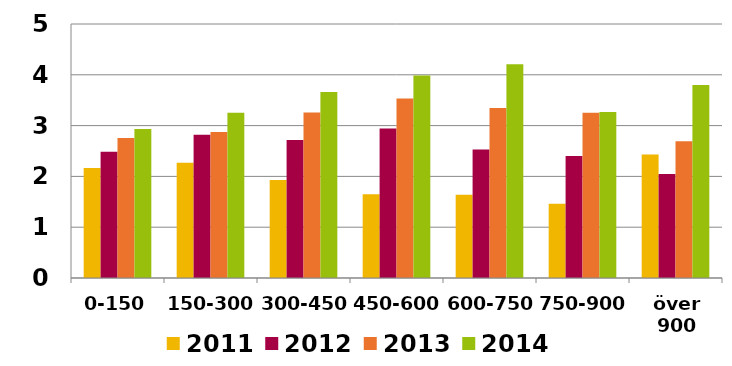
| Category | 2011 | 2012 | 2013 | 2014 |
|---|---|---|---|---|
| 0-150 | 2.166 | 2.486 | 2.757 | 2.933 |
| 150-300 | 2.267 | 2.818 | 2.876 | 3.252 |
| 300-450 | 1.931 | 2.714 | 3.255 | 3.661 |
| 450-600 | 1.646 | 2.942 | 3.533 | 3.987 |
| 600-750 | 1.639 | 2.528 | 3.348 | 4.206 |
| 750-900 | 1.463 | 2.401 | 3.251 | 3.27 |
| över 900 | 2.433 | 2.049 | 2.69 | 3.799 |